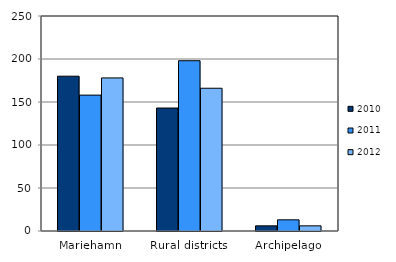
| Category | 2010 | 2011 | 2012 |
|---|---|---|---|
| Mariehamn | 180 | 158 | 178 |
| Rural districts | 143 | 198 | 166 |
| Archipelago | 6 | 13 | 6 |